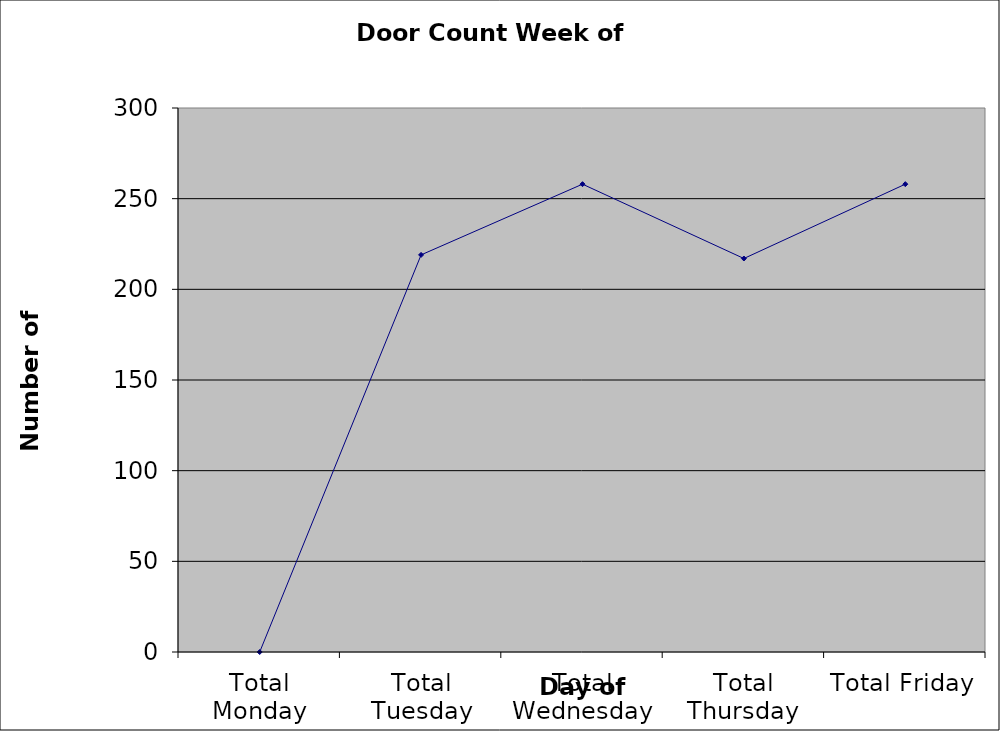
| Category | Series 0 |
|---|---|
| Total Monday | 0 |
| Total Tuesday | 219 |
| Total Wednesday | 258 |
| Total Thursday | 217 |
| Total Friday | 258 |